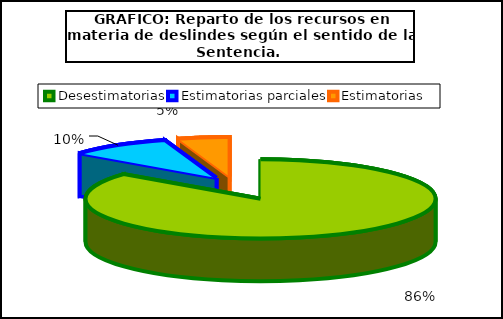
| Category | Número de recursos |
|---|---|
| Desestimatorias | 18 |
| Estimatorias parciales | 2 |
| Estimatorias  | 1 |